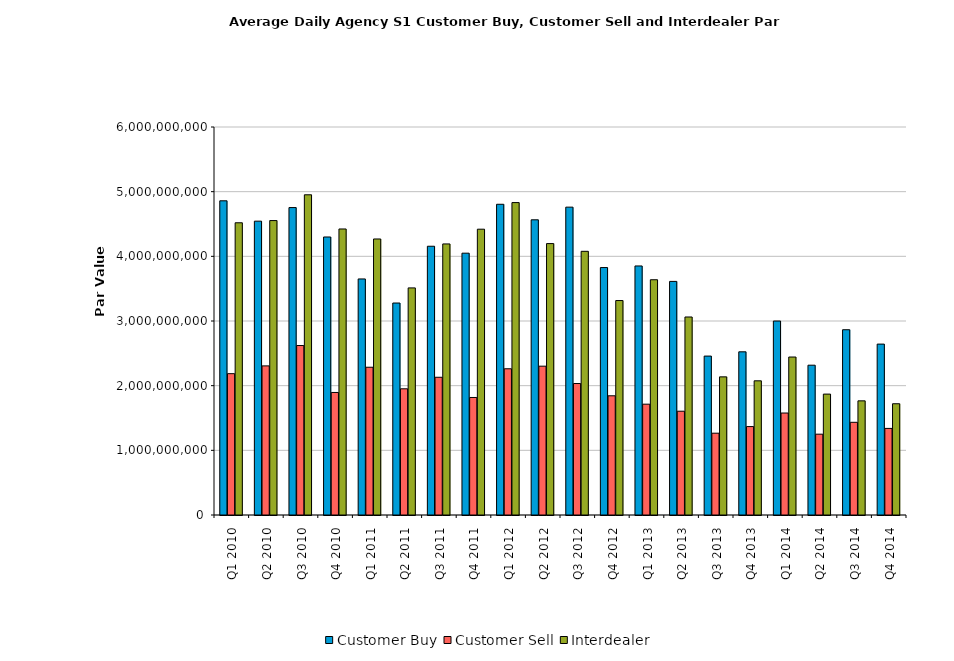
| Category | Customer Buy | Customer Sell | Interdealer |
|---|---|---|---|
| Q1 2010 | 4858619375.474 | 2185588120.792 | 4519073123.667 |
| Q2 2010 | 4543971747.97 | 2305894982.222 | 4553072903.846 |
| Q3 2010 | 4754031557.96 | 2620680990.156 | 4951733425.241 |
| Q4 2010 | 4298988228.978 | 1895014039.473 | 4422971308.328 |
| Q1 2011 | 3650213750.701 | 2284978454.007 | 4268516681.583 |
| Q2 2011 | 3278018479.981 | 1951447853.367 | 3511817513.696 |
| Q3 2011 | 4156019129.176 | 2129817820.81 | 4191803339.987 |
| Q4 2011 | 4048809559.675 | 1817417340.88 | 4419578741.148 |
| Q1 2012 | 4805131828.855 | 2261198234.689 | 4831201719.361 |
| Q2 2012 | 4564915316.16 | 2301348797.814 | 4197235917.869 |
| Q3 2012 | 4760626093.801 | 2033059819.746 | 4077567226.814 |
| Q4 2012 | 3826428782.592 | 1843370485.961 | 3316352390.939 |
| Q1 2013 | 3851219631.559 | 1713833452.241 | 3638013212.416 |
| Q2 2013 | 3612298106.7 | 1604934714.305 | 3062072229.235 |
| Q3 2013 | 2457537054.322 | 1264949555.257 | 2136022394.579 |
| Q4 2013 | 2523325341.425 | 1367516311.497 | 2074871198.099 |
| Q1 2014 | 2999642469.29 | 1576921705.138 | 2442904685.331 |
| Q2 2014 | 2316486911.388 | 1249686632.744 | 1869449035.493 |
| Q3 2014 | 2865047105.23 | 1433524489.264 | 1765300999.422 |
| Q4 2014 | 2642657071.748 | 1338943238.666 | 1720591089.445 |